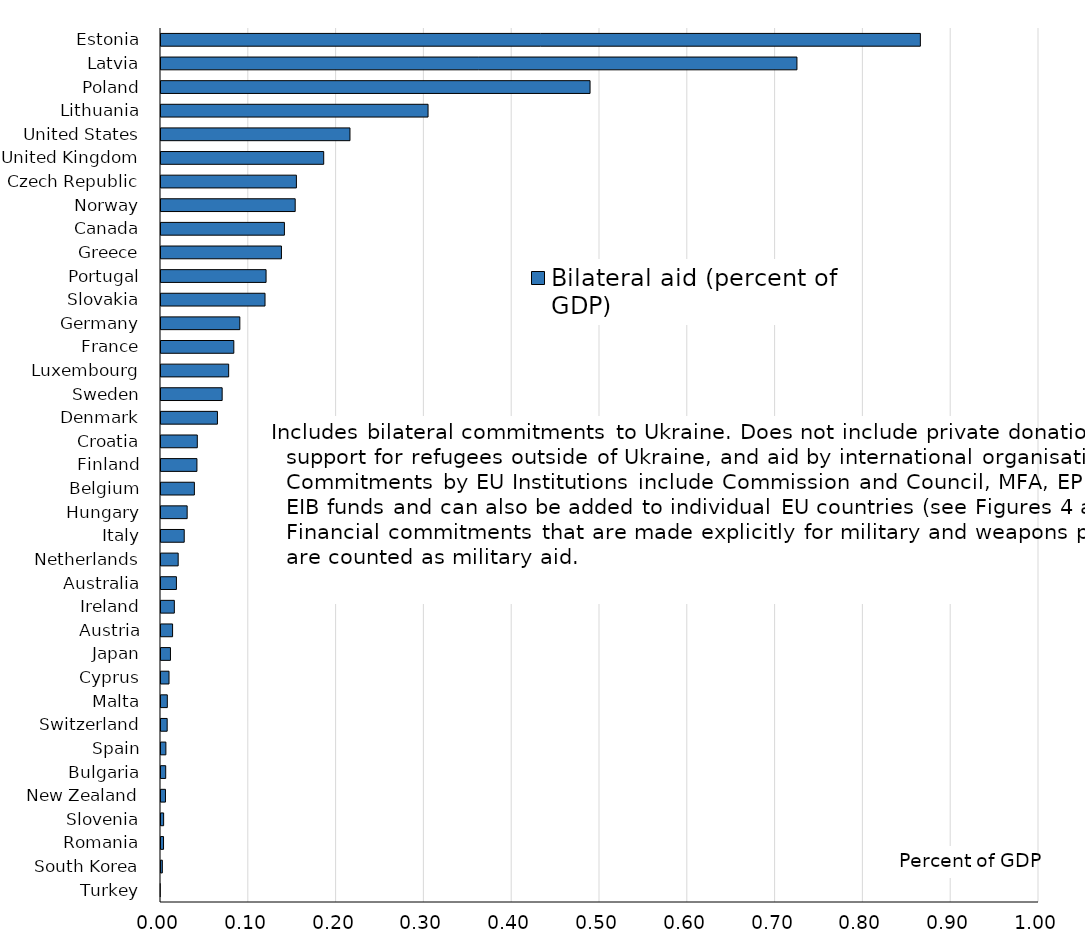
| Category | Bilateral aid (percent of GDP) |
|---|---|
| Estonia | 0.866 |
| Latvia | 0.725 |
| Poland | 0.49 |
| Lithuania | 0.305 |
| United States | 0.216 |
| United Kingdom | 0.186 |
| Czech Republic | 0.155 |
| Norway | 0.154 |
| Canada | 0.142 |
| Greece | 0.138 |
| Portugal | 0.121 |
| Slovakia | 0.12 |
| Germany | 0.091 |
| France | 0.084 |
| Luxembourg | 0.078 |
| Sweden | 0.071 |
| Denmark | 0.065 |
| Croatia | 0.042 |
| Finland | 0.042 |
| Belgium | 0.039 |
| Hungary | 0.031 |
| Italy | 0.028 |
| Netherlands | 0.021 |
| Australia | 0.019 |
| Ireland | 0.016 |
| Austria | 0.014 |
| Japan | 0.012 |
| Cyprus | 0.01 |
| Malta | 0.008 |
| Switzerland | 0.008 |
| Spain | 0.007 |
| Bulgaria | 0.007 |
| New Zealand | 0.006 |
| Slovenia | 0.004 |
| Romania | 0.004 |
| South Korea | 0.003 |
| Turkey | 0 |